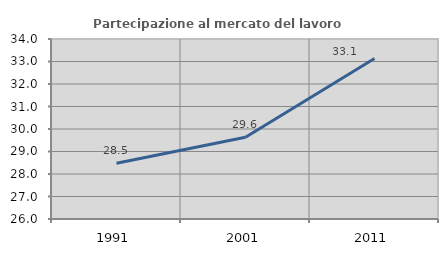
| Category | Partecipazione al mercato del lavoro  femminile |
|---|---|
| 1991.0 | 28.481 |
| 2001.0 | 29.63 |
| 2011.0 | 33.133 |